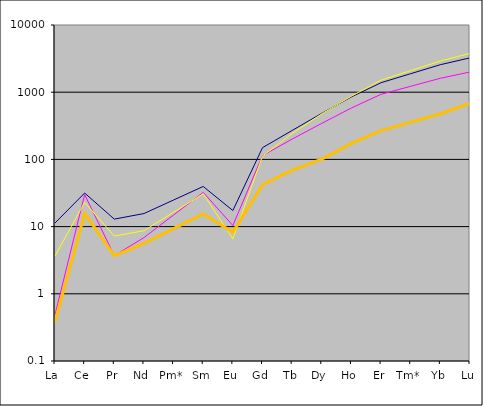
| Category | Series 0 | Series 1 | Series 2 | Series 3 |
|---|---|---|---|---|
| La | 11.312 | 0.487 | 3.657 | 0.385 |
| Ce | 31.62 | 29.959 | 22.91 | 15.675 |
| Pr | 12.924 | 3.697 | 7.22 | 3.706 |
| Nd | 15.637 | 6.852 | 8.681 | 5.631 |
| Pm* | 24.877 | 14.878 | 16.348 | 9.331 |
| Sm | 39.577 | 32.308 | 30.783 | 15.463 |
| Eu | 17.338 | 10.39 | 6.571 | 8.265 |
| Gd | 149.472 | 113.817 | 112.295 | 42.004 |
| Tb | 269.515 | 200.445 | 242.423 | 69.278 |
| Dy | 485.05 | 344.148 | 476.456 | 100.733 |
| Ho | 851.767 | 582.338 | 872.717 | 172.853 |
| Er | 1385.302 | 930.585 | 1511.824 | 267.719 |
| Tm* | 1885.636 | 1224.596 | 2095.427 | 357.979 |
| Yb | 2566.677 | 1611.498 | 2904.317 | 478.669 |
| Lu | 3244.659 | 1997.494 | 3786.223 | 682.702 |